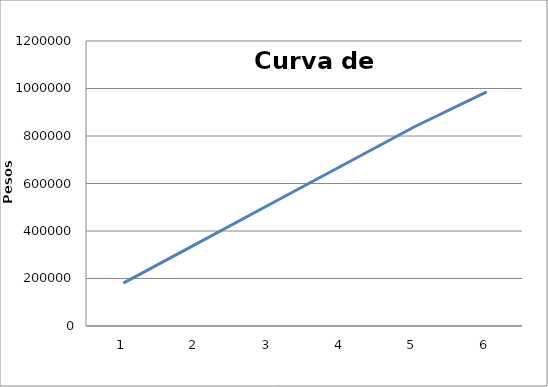
| Category | Series 0 |
|---|---|
| 0 | 180782.062 |
| 1 | 345036.73 |
| 2 | 509291.398 |
| 3 | 673546.065 |
| 4 | 837800.733 |
| 5 | 985611.213 |